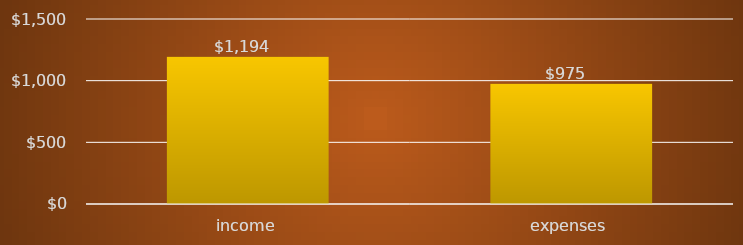
| Category | Data |
|---|---|
| income | 1194 |
| expenses | 975 |